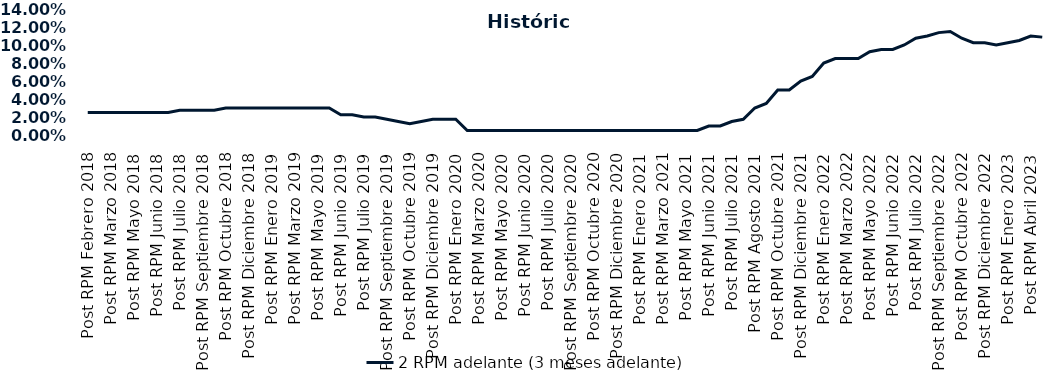
| Category | 2 RPM adelante (3 meses adelante) |
|---|---|
| Post RPM Febrero 2018 | 0.025 |
| Pre RPM Marzo 2018 | 0.025 |
| Post RPM Marzo 2018 | 0.025 |
| Pre RPM Mayo 2018 | 0.025 |
| Post RPM Mayo 2018 | 0.025 |
| Pre RPM Junio 2018 | 0.025 |
| Post RPM Junio 2018 | 0.025 |
| Pre RPM Julio 2018 | 0.025 |
| Post RPM Julio 2018 | 0.028 |
| Pre RPM Septiembre 2018 | 0.028 |
| Post RPM Septiembre 2018 | 0.028 |
| Pre RPM Octubre 2018 | 0.028 |
| Post RPM Octubre 2018 | 0.03 |
| Pre RPM Diciembre 2018 | 0.03 |
| Post RPM Diciembre 2018 | 0.03 |
| Pre RPM Enero 2019 | 0.03 |
| Post RPM Enero 2019 | 0.03 |
| Pre RPM Marzo 2019 | 0.03 |
| Post RPM Marzo 2019 | 0.03 |
| Pre RPM Mayo 2019 | 0.03 |
| Post RPM Mayo 2019 | 0.03 |
| Pre RPM Junio 2019 | 0.03 |
| Post RPM Junio 2019 | 0.022 |
| Pre RPM Julio 2019 | 0.022 |
| Post RPM Julio 2019 | 0.02 |
| Pre RPM Septiembre 2019 | 0.02 |
| Post RPM Septiembre 2019 | 0.018 |
| Pre RPM Octubre 2019 | 0.015 |
| Post RPM Octubre 2019 | 0.012 |
| Pre RPM Diciembre 2019 | 0.015 |
| Post RPM Diciembre 2019 | 0.018 |
| Pre RPM Enero 2020 | 0.018 |
| Post RPM Enero 2020 | 0.018 |
| Pre RPM Marzo 2020 | 0.005 |
| Post RPM Marzo 2020 | 0.005 |
| Pre RPM Mayo 2020 | 0.005 |
| Post RPM Mayo 2020 | 0.005 |
| Pre RPM Junio 2020 | 0.005 |
| Post RPM Junio 2020 | 0.005 |
| Pre RPM Julio 2020 | 0.005 |
| Post RPM Julio 2020 | 0.005 |
| Pre RPM Septiembre 2020 | 0.005 |
| Post RPM Septiembre 2020 | 0.005 |
| Pre RPM Octubre 2020 | 0.005 |
| Post RPM Octubre 2020 | 0.005 |
| Pre RPM Diciembre 2020 | 0.005 |
| Post RPM Diciembre 2020 | 0.005 |
| Pre RPM Enero 2021 | 0.005 |
| Post RPM Enero 2021 | 0.005 |
| Pre RPM Marzo 2021 | 0.005 |
| Post RPM Marzo 2021 | 0.005 |
| Pre RPM Mayo 2021 | 0.005 |
| Post RPM Mayo 2021 | 0.005 |
| Pre RPM Junio 2021 | 0.005 |
| Post RPM Junio 2021 | 0.01 |
| Pre RPM Julio 2021 | 0.01 |
| Post RPM Julio 2021 | 0.015 |
| Pre RPM Agosto 2021 | 0.018 |
| Post RPM Agosto 2021 | 0.03 |
| Pre RPM Octubre 2021 | 0.035 |
| Post RPM Octubre 2021 | 0.05 |
| Pre RPM Diciembre 2021 | 0.05 |
| Post RPM Diciembre 2021 | 0.06 |
| Pre RPM Enero 2022 | 0.065 |
| Post RPM Enero 2022 | 0.08 |
| Pre RPM Marzo 2022 | 0.085 |
| Post RPM Marzo 2022 | 0.085 |
| Pre RPM Mayo 2022 | 0.085 |
| Post RPM Mayo 2022 | 0.092 |
| Pre RPM Junio 2022 | 0.095 |
| Post RPM Junio 2022 | 0.095 |
| Pre RPM Julio 2022 | 0.1 |
| Post RPM Julio 2022 | 0.108 |
| Pre RPM Septiembre 2022 | 0.11 |
| Post RPM Septiembre 2022 | 0.114 |
| Pre RPM Octubre 2022 | 0.115 |
| Post RPM Octubre 2022 | 0.108 |
| Pre RPM Diciembre 2022 | 0.102 |
| Post RPM Diciembre 2022 | 0.102 |
| Pre RPM Enero 2023 | 0.1 |
| Post RPM Enero 2023 | 0.102 |
| Pre RPM Abril 2023 | 0.105 |
| Post RPM Abril 2023 | 0.11 |
| Pre RPM Mayo 2023 | 0.109 |